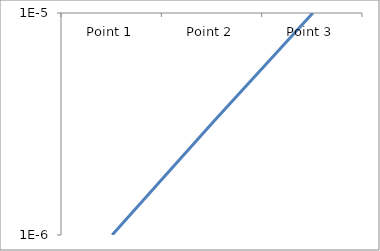
| Category | Series 6 |
|---|---|
| Point 1 | 0 |
| Point 2 | 0 |
| Point 3 | 0 |